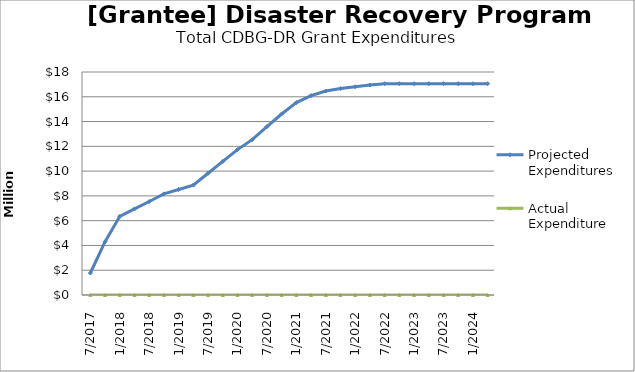
| Category | Projected Expenditures | Actual Expenditure |
|---|---|---|
| 7/2017 | 1776882 | 0 |
| 10/2017 | 4299546 | 0 |
| 1/2018 | 6349546 | 0 |
| 4/2018 | 6949546 | 0 |
| 7/2018 | 7544820 | 0 |
| 10/2018 | 8161536 | 0 |
| 1/2019 | 8516536 | 0 |
| 4/2019 | 8871536 | 0 |
| 7/2019 | 9826536 | 0 |
| 10/2019 | 10781536 | 0 |
| 1/2020 | 11736536 | 0 |
| 4/2020 | 12537536 | 0 |
| 7/2020 | 13588536 | 0 |
| 10/2020 | 14608536 | 0 |
| 1/2021 | 15528536 | 0 |
| 4/2021 | 16098536 | 0 |
| 7/2021 | 16468536 | 0 |
| 10/2021 | 16663536 | 0 |
| 1/2022 | 16808536 | 0 |
| 4/2022 | 16948536 | 0 |
| 7/2022 | 17056880 | 0 |
| 10/2022 | 17056880 | 0 |
| 1/2023 | 17056880 | 0 |
| 4/2023 | 17056880 | 0 |
| 7/2023 | 17056880 | 0 |
| 10/2023 | 17056880 | 0 |
| 1/2024 | 17056880 | 0 |
| 4/2024 | 17056880 | 0 |